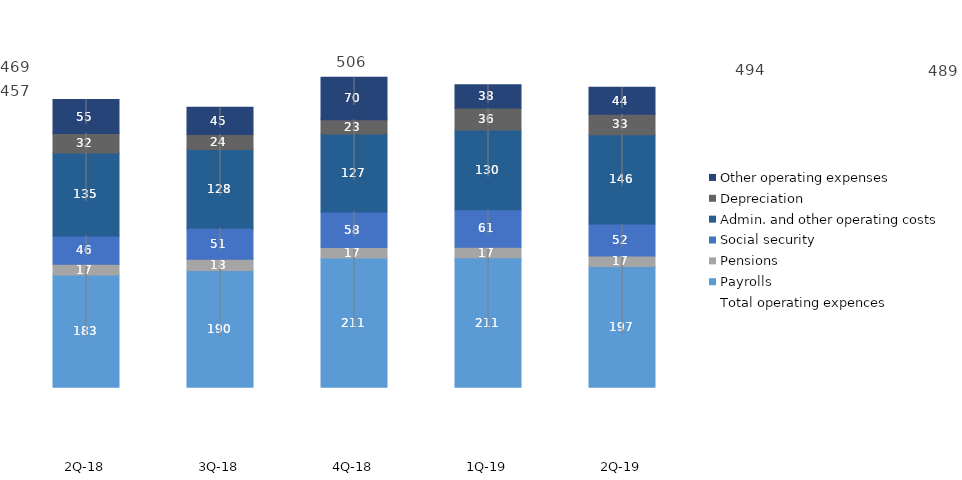
| Category | Payrolls | Pensions | Social security | Admin. and other operating costs | Depreciation | Other operating expenses |
|---|---|---|---|---|---|---|
| 2Q-19 | 196.87 | 17.26 | 52.39 | 145.58 | 33.35 | 43.87 |
| 1Q-19 | 211.174 | 17.185 | 61.24 | 130.252 | 35.543 | 38.331 |
| 4Q-18 | 210.902 | 16.926 | 58.219 | 127.179 | 23.057 | 69.672 |
| 3Q-18 | 190.273 | 18.438 | 50.778 | 128.41 | 24.363 | 44.712 |
| 2Q-18 | 183.153 | 17.319 | 46.468 | 135.219 | 31.886 | 55.331 |